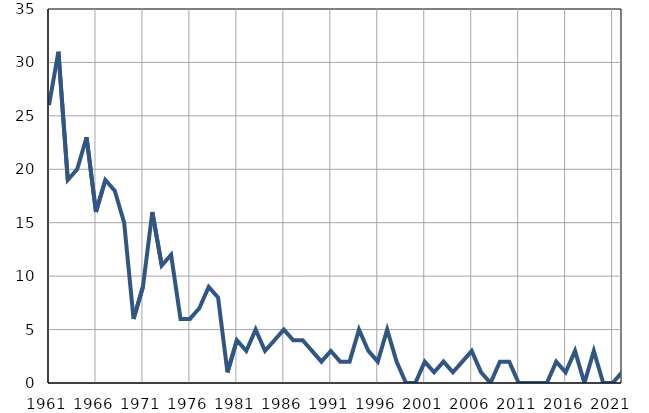
| Category | Умрла 
одојчад |
|---|---|
| 1961.0 | 26 |
| 1962.0 | 31 |
| 1963.0 | 19 |
| 1964.0 | 20 |
| 1965.0 | 23 |
| 1966.0 | 16 |
| 1967.0 | 19 |
| 1968.0 | 18 |
| 1969.0 | 15 |
| 1970.0 | 6 |
| 1971.0 | 9 |
| 1972.0 | 16 |
| 1973.0 | 11 |
| 1974.0 | 12 |
| 1975.0 | 6 |
| 1976.0 | 6 |
| 1977.0 | 7 |
| 1978.0 | 9 |
| 1979.0 | 8 |
| 1980.0 | 1 |
| 1981.0 | 4 |
| 1982.0 | 3 |
| 1983.0 | 5 |
| 1984.0 | 3 |
| 1985.0 | 4 |
| 1986.0 | 5 |
| 1987.0 | 4 |
| 1988.0 | 4 |
| 1989.0 | 3 |
| 1990.0 | 2 |
| 1991.0 | 3 |
| 1992.0 | 2 |
| 1993.0 | 2 |
| 1994.0 | 5 |
| 1995.0 | 3 |
| 1996.0 | 2 |
| 1997.0 | 5 |
| 1998.0 | 2 |
| 1999.0 | 0 |
| 2000.0 | 0 |
| 2001.0 | 2 |
| 2002.0 | 1 |
| 2003.0 | 2 |
| 2004.0 | 1 |
| 2005.0 | 2 |
| 2006.0 | 3 |
| 2007.0 | 1 |
| 2008.0 | 0 |
| 2009.0 | 2 |
| 2010.0 | 2 |
| 2011.0 | 0 |
| 2012.0 | 0 |
| 2013.0 | 0 |
| 2014.0 | 0 |
| 2015.0 | 2 |
| 2016.0 | 1 |
| 2017.0 | 3 |
| 2018.0 | 0 |
| 2019.0 | 3 |
| 2020.0 | 0 |
| 2021.0 | 0 |
| 2022.0 | 1 |